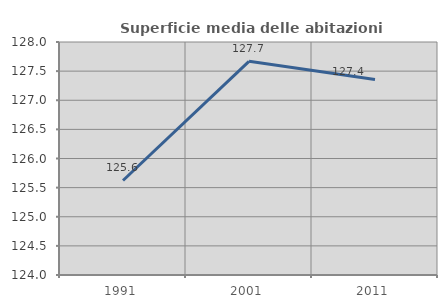
| Category | Superficie media delle abitazioni occupate |
|---|---|
| 1991.0 | 125.623 |
| 2001.0 | 127.668 |
| 2011.0 | 127.355 |